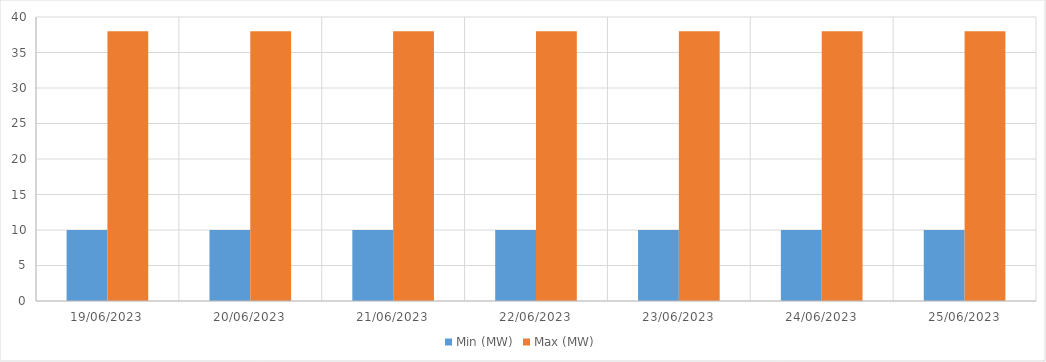
| Category | Min (MW) | Max (MW) |
|---|---|---|
| 19/06/2023 | 10 | 38 |
| 20/06/2023 | 10 | 38 |
| 21/06/2023 | 10 | 38 |
| 22/06/2023 | 10 | 38 |
| 23/06/2023 | 10 | 38 |
| 24/06/2023 | 10 | 38 |
| 25/06/2023 | 10 | 38 |